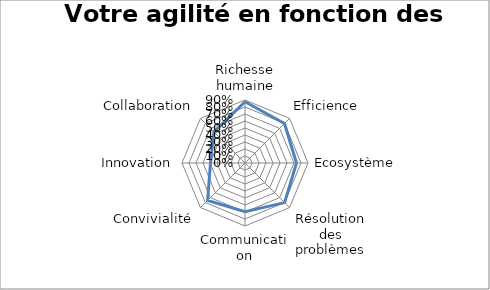
| Category | Series 0 |
|---|---|
| Richesse humaine | 0.875 |
| Efficience | 0.797 |
| Ecosystème | 0.736 |
| Résolution des problèmes | 0.8 |
| Communication | 0.695 |
| Convivialité | 0.756 |
| Innovation | 0.493 |
| Collaboration | 0.629 |